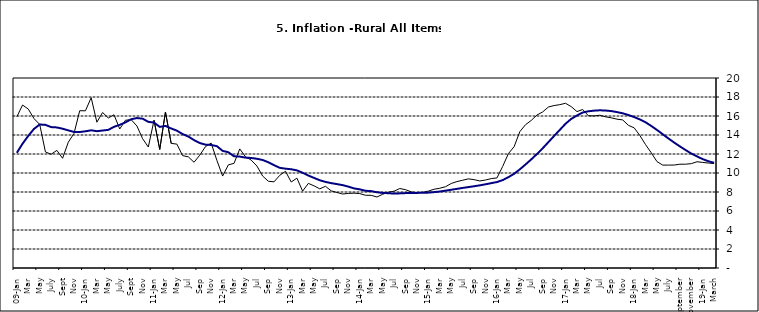
| Category | Series 0 | Series 1 |
|---|---|---|
| 09-Jan | 15.918 | 12.128 |
| Feb | 17.154 | 13.086 |
| Mar | 16.729 | 13.912 |
| Apr | 15.727 | 14.644 |
| May | 15.113 | 15.104 |
| June | 12.213 | 15.067 |
| July | 11.974 | 14.832 |
| Aug | 12.38 | 14.796 |
| Sept | 11.548 | 14.661 |
| Oct | 13.242 | 14.488 |
| Nov | 14.164 | 14.321 |
|  | 16.557 | 14.316 |
| 10-Jan | 16.548 | 14.39 |
| Feb | 17.934 | 14.494 |
| Mar | 15.346 | 14.401 |
| Apr | 16.373 | 14.473 |
| May | 15.794 | 14.54 |
| June | 16.126 | 14.862 |
| July | 14.634 | 15.072 |
| Aug | 15.556 | 15.33 |
| Sept | 15.616 | 15.658 |
| Oct | 14.955 | 15.786 |
| Nov | 13.616 | 15.719 |
| Dec | 12.735 | 15.385 |
| 11-Jan | 15.553 | 15.311 |
| Feb | 12.482 | 14.856 |
| Mar | 16.422 | 14.956 |
| Apr | 13.117 | 14.687 |
| May | 13.041 | 14.457 |
| Jun | 11.83 | 14.095 |
| Jul | 11.699 | 13.84 |
| Aug | 11.13 | 13.464 |
| Sep | 11.878 | 13.156 |
| Oct | 12.778 | 12.985 |
| Nov | 13.147 | 12.95 |
| Dec | 11.326 | 12.824 |
| 12-Jan | 9.678 | 12.33 |
| Feb | 10.856 | 12.188 |
| Mar | 11.014 | 11.76 |
| Apr | 12.536 | 11.724 |
| May | 11.712 | 11.621 |
| Jun | 11.36 | 11.582 |
| Jul | 10.733 | 11.499 |
| Aug | 9.683 | 11.368 |
| Sep | 9.132 | 11.131 |
| Oct | 9.071 | 10.82 |
| Nov | 9.758 | 10.548 |
| Dec | 10.183 | 10.455 |
| 13-Jan | 9.052 | 10.394 |
| Feb | 9.457 | 10.276 |
| Mar | 8.091 | 10.025 |
| Apr | 8.907 | 9.732 |
| May | 8.647 | 9.483 |
| Jun | 8.333 | 9.236 |
| Jul | 8.6 | 9.063 |
| Aug | 8.12 | 8.933 |
| Sep | 7.95 | 8.832 |
| Oct | 7.791 | 8.722 |
| Nov | 7.849 | 8.565 |
| Dec | 7.879 | 8.378 |
| 14-Jan | 7.832 | 8.277 |
| Feb | 7.657 | 8.13 |
| Mar | 7.65 | 8.092 |
| Apr | 7.473 | 7.973 |
| May | 7.761 | 7.901 |
| Jun | 7.98 | 7.874 |
| Jul | 8.086 | 7.834 |
| Aug | 8.368 | 7.858 |
| Sep | 8.244 | 7.883 |
| Oct | 8.019 | 7.903 |
| Nov | 7.898 | 7.906 |
| Dec | 7.955 | 7.913 |
| 15-Jan | 8.094 | 7.935 |
| Feb | 8.291 | 7.988 |
| Mar | 8.396 | 8.05 |
| Apr | 8.556 | 8.14 |
| May | 8.896 | 8.236 |
| Jun | 9.098 | 8.331 |
| Jul | 9.238 | 8.429 |
| Aug | 9.382 | 8.516 |
| Sep | 9.3 | 8.606 |
| Oct | 9.162 | 8.7 |
| Nov | 9.261 | 8.813 |
| Dec | 9.41 | 8.933 |
| 16-Jan | 9.48 | 9.047 |
| Feb | 10.692 | 9.249 |
| Mar | 12.038 | 9.559 |
| Apr | 12.767 | 9.917 |
| May | 14.349 | 10.384 |
| Jun | 15.088 | 10.897 |
| Jul | 15.533 | 11.433 |
| Aug | 16.103 | 12.002 |
| Sep | 16.428 | 12.601 |
| Oct | 16.947 | 13.25 |
| Nov | 17.099 | 13.898 |
| Dec | 17.195 | 14.54 |
| 17-Jan | 17.341 | 15.183 |
| Feb | 16.982 | 15.696 |
| Mar | 16.466 | 16.054 |
| Apr | 16.687 | 16.369 |
| May | 16.023 | 16.497 |
| Jun | 16.007 | 16.563 |
| Jul | 16.078 | 16.6 |
| Aug | 15.914 | 16.577 |
| Sep | 15.812 | 16.52 |
| Oct | 15.666 | 16.411 |
| Nov | 15.587 | 16.285 |
| Dec | 15.018 | 16.104 |
| 18-Jan | 14.756 | 15.892 |
| Feb | 13.957 | 15.638 |
| Mar | 12.987 | 15.339 |
| Apr | 12.126 | 14.95 |
| May | 11.199 | 14.53 |
| June | 10.832 | 14.083 |
| July | 10.831 | 13.636 |
| August | 10.838 | 13.209 |
| September | 10.924 | 12.804 |
| October | 10.927 | 12.418 |
| November | 10.986 | 12.049 |
| December | 11.183 | 11.746 |
| 19-Jan | 11.115 | 11.462 |
| February | 11.048 | 11.234 |
| March | 10.99 | 11.078 |